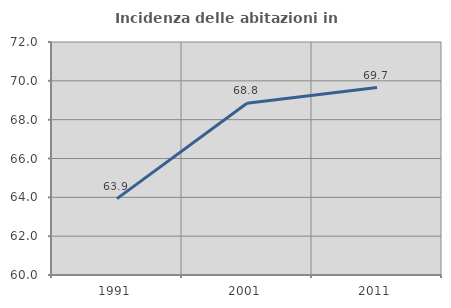
| Category | Incidenza delle abitazioni in proprietà  |
|---|---|
| 1991.0 | 63.934 |
| 2001.0 | 68.845 |
| 2011.0 | 69.656 |